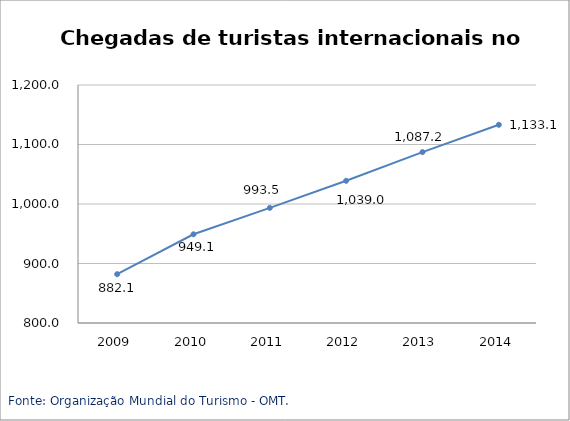
| Category | Mundo |
|---|---|
| 2009.0 | 882.1 |
| 2010.0 | 949.1 |
| 2011.0 | 993.5 |
| 2012.0 | 1039 |
| 2013.0 | 1087.2 |
| 2014.0 | 1133.1 |